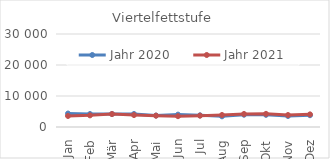
| Category | Jahr 2020 | Jahr 2021 |
|---|---|---|
| 0 | 4343.532 | 3560.958 |
| 1 | 4182.024 | 3755.064 |
| 2 | 4200.216 | 4178.887 |
| 3 | 4190.278 | 3853.612 |
| 4 | 3703.596 | 3649.111 |
| 5 | 3991.631 | 3490.514 |
| 6 | 3763.281 | 3657.817 |
| 7 | 3448.54 | 3872.859 |
| 8 | 3959.001 | 4198.75 |
| 9 | 3927.997 | 4237.079 |
| 10 | 3555.599 | 3856.472 |
| 11 | 3803.142 | 4076.638 |